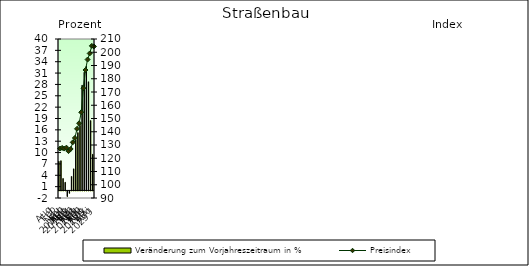
| Category | Veränderung zum Vorjahreszeitraum in % |
|---|---|
| 0 | 7.699 |
| 1 | 7.848 |
| 2 | 3.16 |
| 3 | 2.155 |
| 4 | -1.493 |
| 5 | -0.626 |
| 6 | 3.692 |
| 7 | 5.703 |
| 8 | 13.397 |
| 9 | 15.276 |
| 10 | 17.197 |
| 11 | 27.79 |
| 12 | 31.224 |
| 13 | 32.855 |
| 14 | 28.701 |
| 15 | 18.45 |
| 16 | 9.539 |